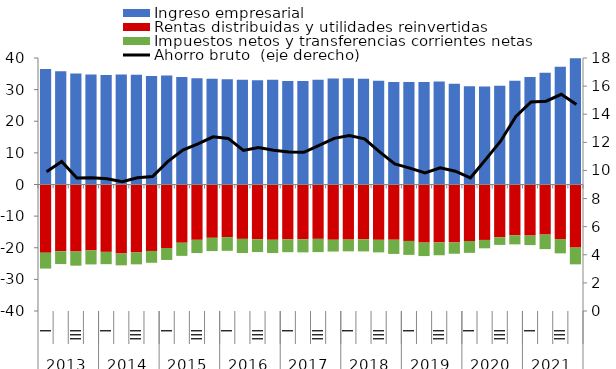
| Category | Ingreso empresarial | Rentas distribuidas y utilidades reinvertidas | Impuestos netos y transferencias corrientes netas |
|---|---|---|---|
| 0 | 36.497 | -21.58 | -5.01 |
| 1 | 35.797 | -21.119 | -4.037 |
| 2 | 35.122 | -21.201 | -4.464 |
| 3 | 34.755 | -20.855 | -4.415 |
| 4 | 34.604 | -21.301 | -3.89 |
| 5 | 34.76 | -21.811 | -3.748 |
| 6 | 34.727 | -21.527 | -3.72 |
| 7 | 34.324 | -20.996 | -3.76 |
| 8 | 34.491 | -20.077 | -3.784 |
| 9 | 34.019 | -18.415 | -4.156 |
| 10 | 33.572 | -17.49 | -4.184 |
| 11 | 33.449 | -16.858 | -4.197 |
| 12 | 33.243 | -16.642 | -4.324 |
| 13 | 33.089 | -17.197 | -4.466 |
| 14 | 32.999 | -17.323 | -4.039 |
| 15 | 33.116 | -17.474 | -4.203 |
| 16 | 32.712 | -17.342 | -4.06 |
| 17 | 32.75 | -17.322 | -4.136 |
| 18 | 33.154 | -17.19 | -4.189 |
| 19 | 33.487 | -17.474 | -3.732 |
| 20 | 33.611 | -17.416 | -3.719 |
| 21 | 33.409 | -17.328 | -3.827 |
| 22 | 32.778 | -17.488 | -3.974 |
| 23 | 32.419 | -17.467 | -4.486 |
| 24 | 32.418 | -17.853 | -4.397 |
| 25 | 32.449 | -18.367 | -4.265 |
| 26 | 32.564 | -18.303 | -4.072 |
| 27 | 31.84 | -18.325 | -3.567 |
| 28 | 31.09 | -17.872 | -3.742 |
| 29 | 30.95 | -17.533 | -2.645 |
| 30 | 31.2 | -16.711 | -2.39 |
| 31 | 32.77 | -16.091 | -2.844 |
| 32 | 34.028 | -16.144 | -3.015 |
| 33 | 35.359 | -15.837 | -4.596 |
| 34 | 37.195 | -17.246 | -4.529 |
| 35 | 39.94 | -19.948 | -5.297 |